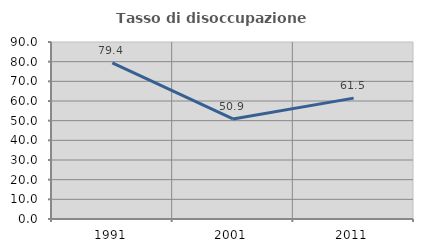
| Category | Tasso di disoccupazione giovanile  |
|---|---|
| 1991.0 | 79.352 |
| 2001.0 | 50.877 |
| 2011.0 | 61.468 |